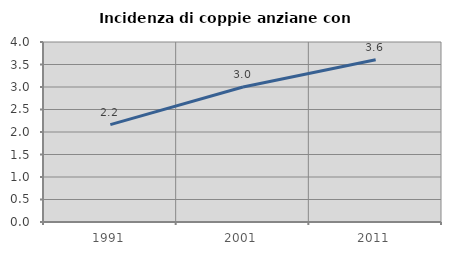
| Category | Incidenza di coppie anziane con figli |
|---|---|
| 1991.0 | 2.164 |
| 2001.0 | 2.999 |
| 2011.0 | 3.604 |